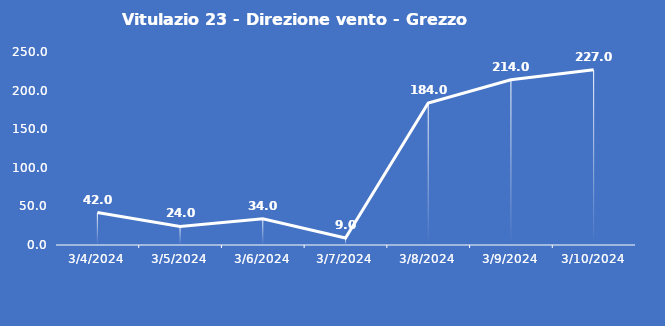
| Category | Vitulazio 23 - Direzione vento - Grezzo (°N) |
|---|---|
| 3/4/24 | 42 |
| 3/5/24 | 24 |
| 3/6/24 | 34 |
| 3/7/24 | 9 |
| 3/8/24 | 184 |
| 3/9/24 | 214 |
| 3/10/24 | 227 |